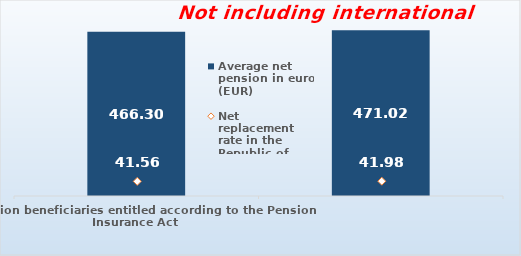
| Category | Average net pension in euros (EUR)  |
|---|---|
| Pension beneficiaries entitled according to the Pension Insurance Act   | 466.3 |
| Pension beneficiaries entitled to pension FOR THE FIRST TIME in 2023 according to the Pension Insurance Act  - NEW BENEFICIARIES | 471.018 |